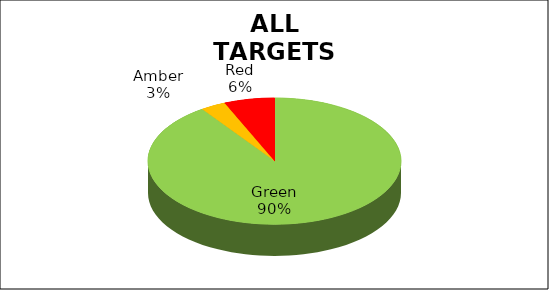
| Category | Series 0 |
|---|---|
| Green | 0.903 |
| Amber | 0.032 |
| Red | 0.065 |